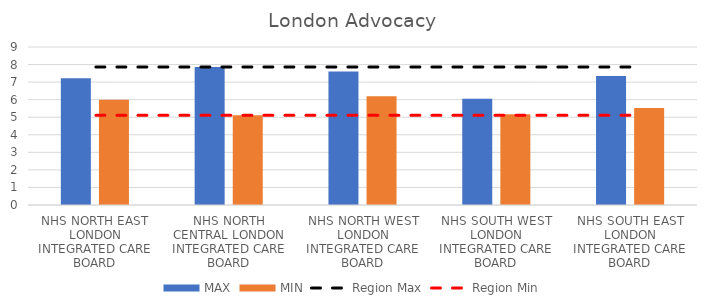
| Category | MAX | MIN |
|---|---|---|
| NHS NORTH EAST LONDON INTEGRATED CARE BOARD | 7.222 | 5.991 |
| NHS NORTH CENTRAL LONDON INTEGRATED CARE BOARD | 7.861 | 5.107 |
| NHS NORTH WEST LONDON INTEGRATED CARE BOARD | 7.604 | 6.19 |
| NHS SOUTH WEST LONDON INTEGRATED CARE BOARD | 6.056 | 5.175 |
| NHS SOUTH EAST LONDON INTEGRATED CARE BOARD | 7.352 | 5.532 |